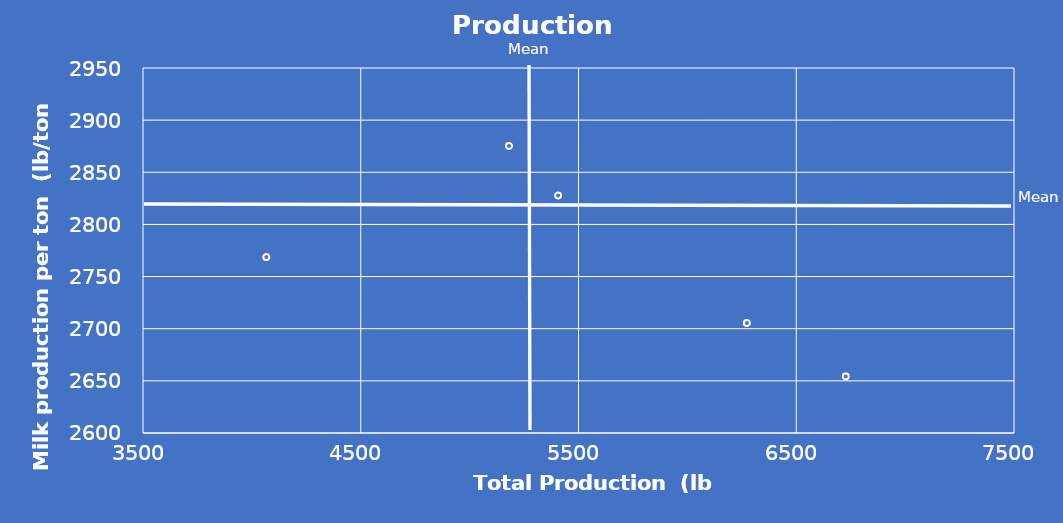
| Category | Series 0 |
|---|---|
| 6273.141060242 | 2705.5 |
| 5180.775970579 | 2875.25 |
| 4066.144450707 | 2768.75 |
| 6727.239604766 | 2654.25 |
| 5406.106772703 | 2827.75 |